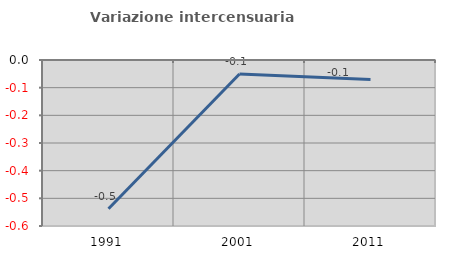
| Category | Variazione intercensuaria annua |
|---|---|
| 1991.0 | -0.538 |
| 2001.0 | -0.05 |
| 2011.0 | -0.071 |